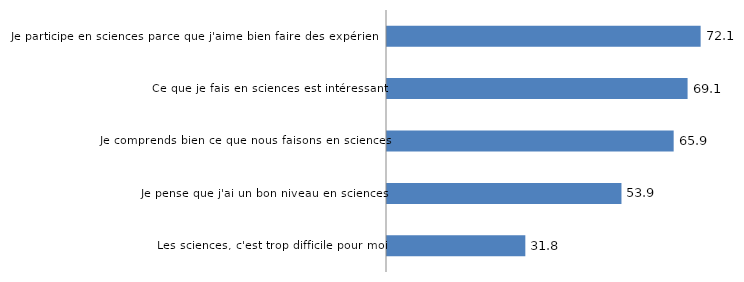
| Category | Souvent ou très souvent |
|---|---|
| Les sciences, c'est trop difficile pour moi | 31.8 |
| Je pense que j'ai un bon niveau en sciences | 53.9 |
| Je comprends bien ce que nous faisons en sciences | 65.9 |
| Ce que je fais en sciences est intéressant | 69.1 |
| Je participe en sciences parce que j'aime bien faire des expériences | 72.1 |